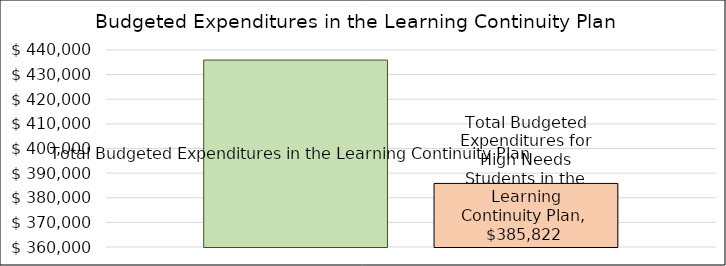
| Category | Total Budgeted Expenditures in the Learning Continuity Plan | Total Budgeted Expenditures for High Needs Students in the Learning Continuity Plan |
|---|---|---|
| 0 | 435913.503 | 385822.003 |